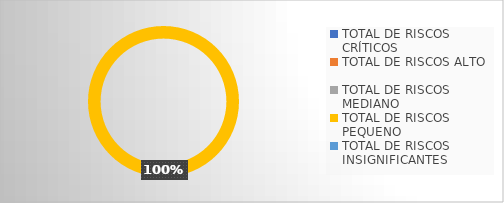
| Category | Series 0 | Series 1 | Series 2 |
|---|---|---|---|
| TOTAL DE RISCOS CRÍTICOS |  |  | 0 |
| TOTAL DE RISCOS ALTO |  |  | 0 |
| TOTAL DE RISCOS MEDIANO |  |  | 0 |
| TOTAL DE RISCOS PEQUENO |  |  | 1 |
| TOTAL DE RISCOS INSIGNIFICANTES |  |  | 0 |